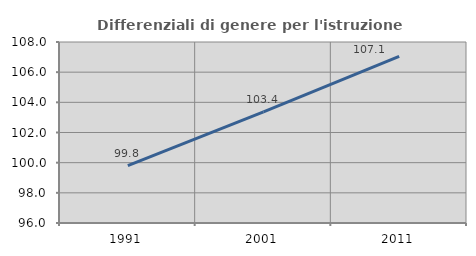
| Category | Differenziali di genere per l'istruzione superiore |
|---|---|
| 1991.0 | 99.81 |
| 2001.0 | 103.371 |
| 2011.0 | 107.052 |